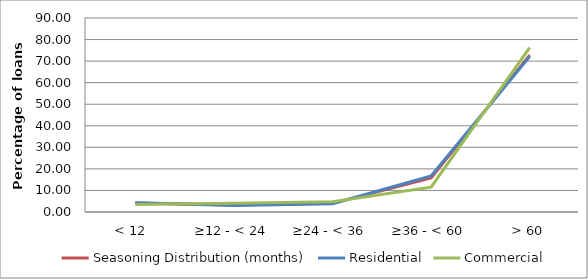
| Category | Seasoning Distribution (months) | Residential | Commercial |
|---|---|---|---|
| < 12  | 4.158 | 4.299 | 3.48 |
| ≥12 - < 24 | 3.201 | 3.026 | 4.043 |
| ≥24 - < 36 | 4.005 | 3.856 | 4.721 |
| ≥36 - < 60 | 15.836 | 16.731 | 11.53 |
| > 60 | 72.8 | 72.088 | 76.226 |